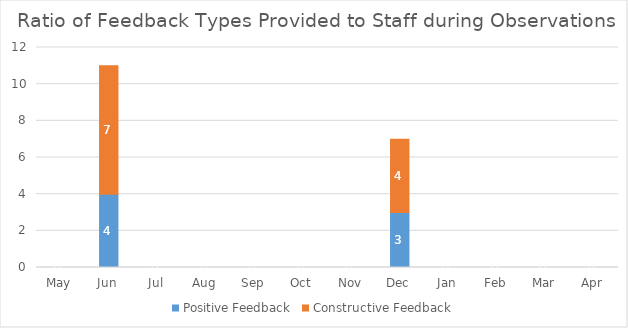
| Category | Positive Feedback | Constructive Feedback |
|---|---|---|
| May | 0 | 0 |
| Jun | 4 | 7 |
| Jul | 0 | 0 |
| Aug | 0 | 0 |
| Sep | 0 | 0 |
| Oct | 0 | 0 |
| Nov | 0 | 0 |
| Dec | 3 | 4 |
| Jan | 0 | 0 |
| Feb | 0 | 0 |
| Mar | 0 | 0 |
| Apr | 0 | 0 |